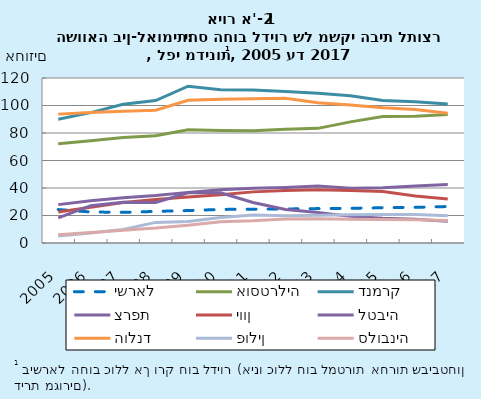
| Category | ישראל | אוסטרליה | דנמרק | צרפת | יוון | לטביה | הולנד | פולין | סלובניה |
|---|---|---|---|---|---|---|---|---|---|
| 2005.0 | 24.311 | 72.11 | 89.956 | 27.909 | 22.576 | 18.313 | 93.728 | 5.098 | 5.977 |
| 2006.0 | 22.562 | 74.312 | 94.839 | 30.685 | 25.996 | 27.126 | 94.867 | 7.292 | 7.669 |
| 2007.0 | 22.295 | 76.66 | 100.958 | 32.948 | 29.511 | 29.665 | 95.782 | 9.858 | 9.321 |
| 2008.0 | 22.978 | 77.966 | 103.581 | 34.492 | 31.684 | 29.534 | 96.541 | 14.991 | 10.858 |
| 2009.0 | 23.604 | 82.432 | 114.063 | 36.817 | 33.479 | 36.496 | 103.77 | 15.671 | 12.981 |
| 2010.0 | 24.419 | 81.79 | 111.5 | 38.659 | 35.178 | 36.565 | 104.61 | 18.518 | 15.513 |
| 2011.0 | 24.586 | 81.635 | 111.224 | 39.809 | 37.181 | 29.508 | 104.851 | 20.402 | 16.179 |
| 2012.0 | 24.748 | 82.772 | 110.262 | 40.403 | 38.262 | 24.372 | 105.317 | 19.818 | 17.411 |
| 2013.0 | 25.019 | 83.364 | 108.838 | 41.481 | 38.676 | 22.215 | 101.922 | 20.194 | 17.686 |
| 2014.0 | 25.223 | 88.085 | 107.018 | 39.757 | 38.165 | 19.367 | 100.447 | 20.562 | 17.233 |
| 2015.0 | 25.661 | 91.979 | 103.655 | 40.192 | 37.438 | 18.087 | 98.442 | 20.742 | 17.178 |
| 2016.0 | 25.937 | 92.268 | 102.741 | 41.51 | 34.111 | 17.33 | 97.056 | 20.747 | 16.904 |
| 2017.0 | 26.524 | 93.406 | 101.047 | 42.571 | 31.973 | 15.81 | 94.324 | 19.807 | 16.414 |